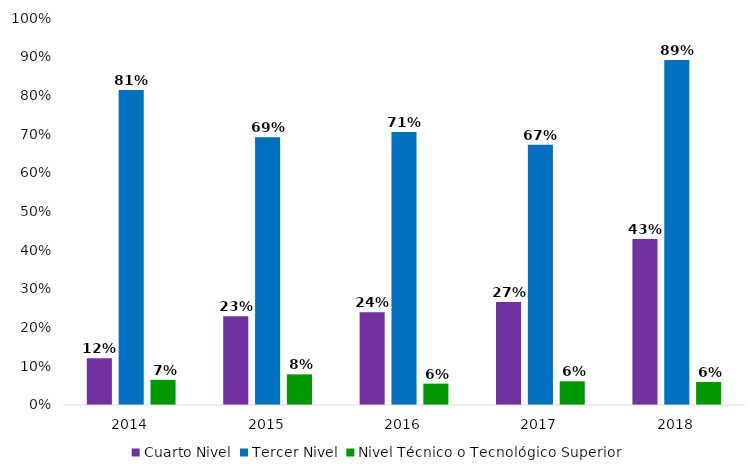
| Category | Cuarto Nivel | Tercer Nivel | Nivel Técnico o Tecnológico Superior |
|---|---|---|---|
| 2014.0 | 0.121 | 0.814 | 0.065 |
| 2015.0 | 0.229 | 0.692 | 0.079 |
| 2016.0 | 0.239 | 0.705 | 0.055 |
| 2017.0 | 0.266 | 0.672 | 0.061 |
| 2018.0 | 0.429 | 0.891 | 0.059 |